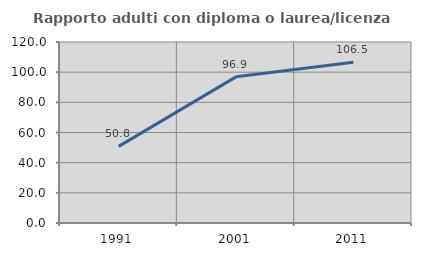
| Category | Rapporto adulti con diploma o laurea/licenza media  |
|---|---|
| 1991.0 | 50.813 |
| 2001.0 | 96.89 |
| 2011.0 | 106.538 |